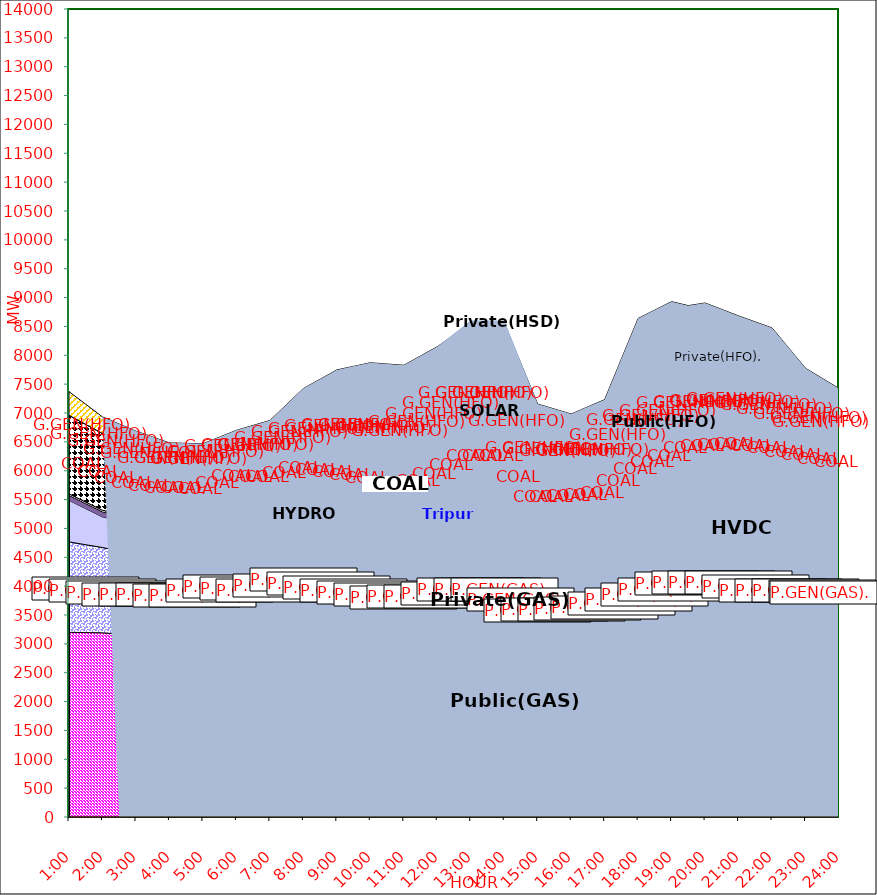
| Category | GAS | P.GEN(GAS). |  HVDC | TRIPURA | HYDRO | COAL | SOLAR | G.GEN(HFO) | P.GEN(HFO). | G.GEN(HSD) | P.GEN(HSD) | SHORTAGE | Total Energy Gen 186.322 MKWHr 
Energy Not Served   0.000 MKWHr 
Energy Requirement     186.322 MKWHr  |
|---|---|---|---|---|---|---|---|---|---|---|---|---|---|
| 1:00 | 3200 | 1567 | 719 | 84 | 30 | 1361 | 0 | 0 | 410 | 0 | 0 | 0 |  |
| 1:30 | 3195.5 | 1522.5 | 624.5 | 85 | 30 | 1346 | 0 | 0 | 348 | 0 | 0 | 0 |  |
| 2:00 | 3191 | 1478 | 530 | 86 | 30 | 1331 | 0 | 0 | 286 | 0 | 0 | 0 |  |
| 2:30 | 3169.5 | 1441.5 | 530 | 82 | 30 | 1266 | 0 | 0 | 290 | 0 | 0 | 0 |  |
| 3:00 | 3148 | 1405 | 530 | 78 | 30 | 1201 | 0 | 0 | 294 | 0 | 0 | 0 |  |
| 3:30 | 3146.5 | 1407 | 530 | 80 | 30 | 1117 | 0 | 0 | 273 | 0 | 0 | 0 |  |
| 4:00 | 3145 | 1409 | 530 | 82 | 30 | 1033 | 0 | 0 | 252 | 0 | 0 | 0 |  |
| 4:30 | 3140.5 | 1407.5 | 530.5 | 77 | 30 | 1036.5 | 0 | 0 | 252 | 0 | 0 | 0 |  |
| 5:00 | 3136 | 1406 | 531 | 72 | 30 | 1040 | 0 | 0 | 252 | 0 | 0 | 0 |  |
| 5:30 | 3194 | 1450 | 530.5 | 76 | 30 | 1045.5 | 0 | 0 | 257 | 0 | 0 | 0 |  |
| 6:00 | 3252 | 1494 | 530 | 80 | 30 | 1051 | 0 | 0 | 262 | 0 | 0 | 0 |  |
| 6:30 | 3204.5 | 1515.5 | 530.5 | 82 | 30 | 1084 | 2 | 0 | 336 | 0 | 0 | 0 |  |
| 7:00 | 3157 | 1537 | 531 | 84 | 30 | 1117 | 4 | 0 | 410 | 0 | 0 | 0 |  |
| 7:30 | 3239.5 | 1558 | 508.5 | 78 | 30 | 1122 | 32 | 0 | 578.5 | 0 | 0 | 0 |  |
| 8:00 | 3322 | 1579 | 486 | 72 | 30 | 1127 | 60 | 0 | 747 | 0 | 0 | 0 |  |
| 8:30 | 3245.5 | 1596 | 486 | 70 | 30 | 1185.5 | 112.5 | 10.5 | 848.5 | 0 | 0 | 0 |  |
| 9:00 | 3169 | 1613 | 486 | 68 | 30 | 1244 | 165 | 21 | 950 | 0 | 0 | 0 |  |
| 9:30 | 3153 | 1553 | 486 | 73 | 30 | 1274 | 206.5 | 39 | 993.5 | 0 | 0 | 0 |  |
| 10:00 | 3137 | 1493 | 486 | 78 | 30 | 1304 | 248 | 57 | 1037 | 0 | 0 | 0 |  |
| 10:30 | 3133.5 | 1428 | 486 | 79 | 30 | 1281 | 277 | 71.5 | 1062.5 | 0 | 0 | 0 |  |
| 11:00 | 3130 | 1363 | 486 | 80 | 30 | 1258 | 306 | 86 | 1088 | 0 | 0 | 0 |  |
| 11:30 | 3153.5 | 1317 | 604 | 80 | 30 | 1299.5 | 312 | 99 | 1092.5 | 0 | 0 | 0 |  |
| 12:00 | 3177 | 1271 | 722 | 80 | 30 | 1341 | 318 | 112 | 1097 | 0 | 0 | 0 |  |
| 12:30 | 3174 | 1406 | 722 | 85 | 30 | 1382.5 | 316.5 | 116.5 | 1117.5 | 0 | 23 | 0 |  |
| 13:00 | 3171 | 1541 | 722 | 90 | 30 | 1424 | 315 | 121 | 1138 | 0 | 46 | 0 |  |
| 13:30 | 3171 | 1541 | 722 | 90 | 30 | 1424 | 315 | 121 | 1138 | 0 | 46 | 0 |  |
| 14:00 | 3171 | 1541 | 722 | 90 | 30 | 1424 | 315 | 121 | 1138 | 0 | 46 | 0 |  |
| 14:30 | 3091 | 1338.5 | 698.5 | 82 | 30 | 1332 | 248.5 | 112.5 | 920.5 | 0 | 23 | 0 |  |
| 15:00 | 3011 | 1136 | 675 | 74 | 30 | 1240 | 182 | 104 | 703 | 0 | 0 | 0 |  |
| 15:30 | 3033.5 | 1108 | 675 | 73 | 30 | 1269 | 136 | 109 | 635 | 0 | 0 | 0 |  |
| 16:00 | 3056 | 1080 | 675 | 72 | 30 | 1298 | 90 | 114 | 567 | 0 | 0 | 0 |  |
| 16:30 | 3051.5 | 1117 | 674 | 73 | 30 | 1300.5 | 53 | 125.5 | 682 | 0 | 0 | 0 |  |
| 17:00 | 3047 | 1154 | 673 | 74 | 30 | 1303 | 16 | 137 | 797 | 0 | 0 | 0 |  |
| 17:30 | 3064 | 1268 | 720.5 | 81 | 30 | 1348.5 | 8 | 211.5 | 1203 | 0 | 0 | 0 |  |
| 18:00 | 3081 | 1382 | 768 | 88 | 30 | 1394 | 0 | 286 | 1609 | 0 | 0 | 0 |  |
| 18:30 | 3147.5 | 1425 | 756.5 | 86 | 30 | 1418 | 0 | 202.5 | 1718 | 0 | 0 | 0 |  |
| 19:00 | 3214 | 1468 | 745 | 84 | 30 | 1442 | 0 | 119 | 1827 | 0 | 0 | 0 |  |
| 19:30 | 3290 | 1498 | 745 | 84 | 30 | 1502 | 0 | 59 | 1652 | 0 | 0 | 0 |  |
| 20:00 | 3317 | 1503 | 745 | 86 | 30 | 1497 | 0 | 43 | 1685 | 0 | 0 | 0 |  |
| 20:30 | 3307.5 | 1520 | 756.5 | 88 | 30 | 1500.5 | 0 | 43 | 1548.5 | 0 | 0 | 0 |  |
| 21:00 | 3298 | 1537 | 768 | 90 | 30 | 1504 | 0 | 43 | 1412 | 0 | 0 | 0 |  |
| 21:30 | 3235.5 | 1525.5 | 816 | 88 | 30 | 1481 | 0 | 43 | 1359 | 0 | 0 | 0 |  |
| 22:00 | 3173 | 1514 | 864 | 86 | 30 | 1458 | 0 | 43 | 1306 | 0 | 0 | 0 |  |
| 22:30 | 3173 | 1503.5 | 816 | 87 | 30 | 1450.5 | 0 | 21.5 | 1043 | 0 | 0 | 0 |  |
| 23:00 | 3173 | 1493 | 768 | 88 | 30 | 1443 | 0 | 0 | 780 | 0 | 0 | 0 |  |
| 23:30 | 3163.5 | 1487.5 | 745.5 | 89 | 30 | 1408 | 0 | 0 | 676 | 0 | 0 | 0 |  |
| 24:00 | 3154 | 1482 | 723 | 90 | 30 | 1373 | 0 | 0 | 572 | 0 | 0 | 0 |  |